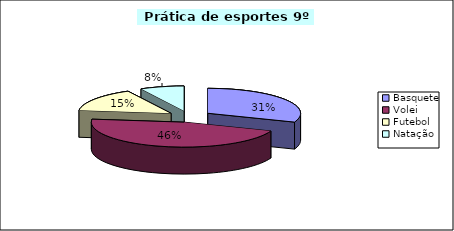
| Category | Meninos | Meninas |
|---|---|---|
| Basquete | 8 | 2 |
| Volei | 12 | 6 |
| Futebol | 4 | 2 |
| Natação | 2 | 10 |